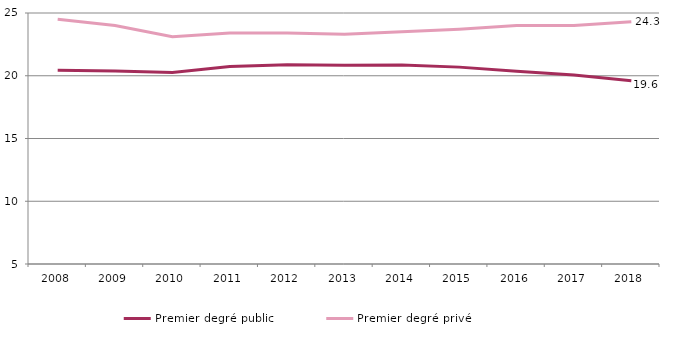
| Category | Premier degré public | Premier degré privé |
|---|---|---|
| 2008.0 | 20.443 | 24.5 |
| 2009.0 | 20.377 | 24 |
| 2010.0 | 20.263 | 23.1 |
| 2011.0 | 20.743 | 23.4 |
| 2012.0 | 20.882 | 23.4 |
| 2013.0 | 20.844 | 23.3 |
| 2014.0 | 20.847 | 23.5 |
| 2015.0 | 20.687 | 23.7 |
| 2016.0 | 20.363 | 24 |
| 2017.0 | 20.053 | 24 |
| 2018.0 | 19.6 | 24.3 |